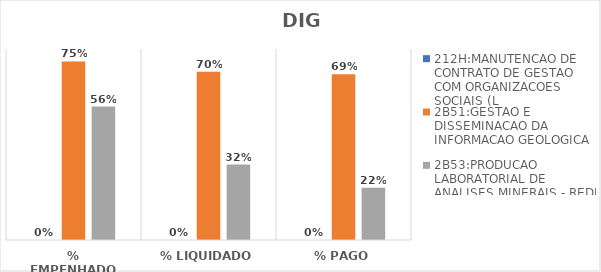
| Category | 212H:MANUTENCAO DE CONTRATO DE GESTAO COM ORGANIZACOES SOCIAIS (L | 2B51:GESTAO E DISSEMINACAO DA INFORMACAO GEOLOGICA | 2B53:PRODUCAO LABORATORIAL DE ANALISES MINERAIS - REDE LAMIN |
|---|---|---|---|
| % EMPENHADO | 0 | 0.748 | 0.559 |
| % LIQUIDADO | 0 | 0.705 | 0.316 |
| % PAGO | 0 | 0.694 | 0.219 |